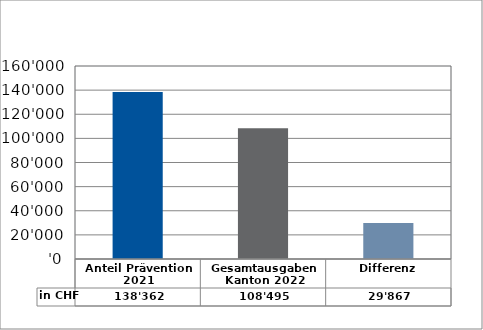
| Category | in CHF |
|---|---|
| Anteil Prävention 2021

 | 138362.25 |
| Gesamtausgaben Kanton 2022
 | 108495.05 |
| Differenz | 29867.2 |